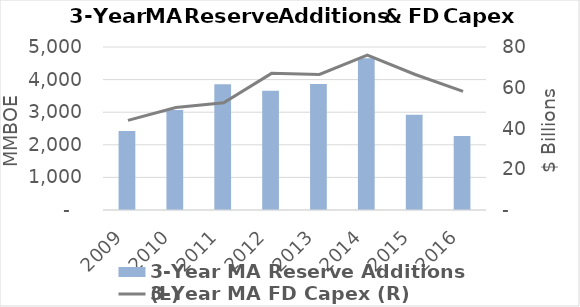
| Category | 3-Year MA Reserve Additions (L) |
|---|---|
| 2009 | 2422.563 |
| 2010 | 3069.639 |
| 2011 | 3861.145 |
| 2012 | 3657.403 |
| 2013 | 3863.926 |
| 2014 | 4654.099 |
| 2015 | 2921.35 |
| 2016 | 2267.789 |